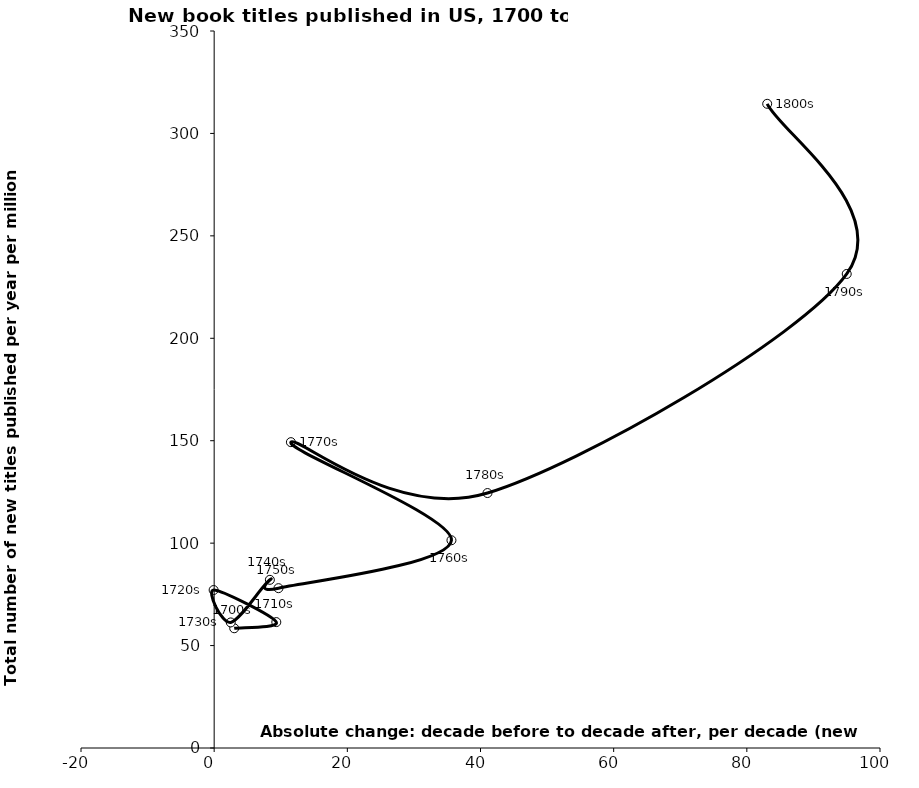
| Category | Series 0 |
|---|---|
| 3.010483969432869 | 58.448 |
| 9.332898682552088 | 61.459 |
| -0.08185142885520236 | 77.114 |
| 2.488623490143546 | 61.295 |
| 8.36499333954524 | 82.092 |
| 9.659670974999848 | 78.025 |
| 35.6376426328196 | 101.411 |
| 11.52302655011615 | 149.301 |
| 41.050821513274414 | 124.457 |
| 95.00165077412582 | 231.402 |
| 83.05804486087393 | 314.46 |